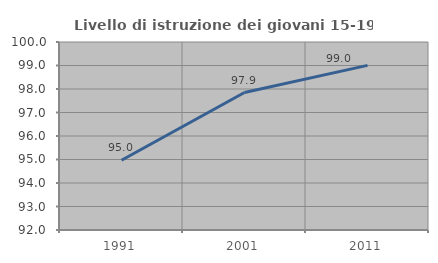
| Category | Livello di istruzione dei giovani 15-19 anni |
|---|---|
| 1991.0 | 94.97 |
| 2001.0 | 97.851 |
| 2011.0 | 99.006 |